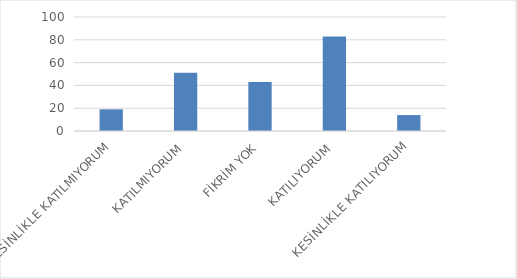
| Category | Series 0 |
|---|---|
| KESİNLİKLE KATILMIYORUM | 19 |
| KATILMIYORUM | 51 |
| FİKRİM YOK | 43 |
| KATILIYORUM | 83 |
| KESİNLİKLE KATILIYORUM | 14 |